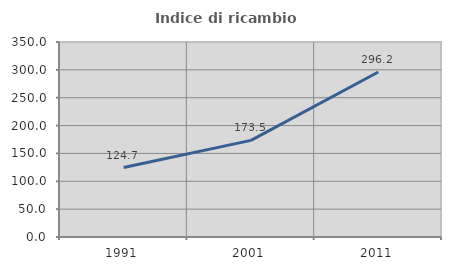
| Category | Indice di ricambio occupazionale  |
|---|---|
| 1991.0 | 124.713 |
| 2001.0 | 173.488 |
| 2011.0 | 296.171 |